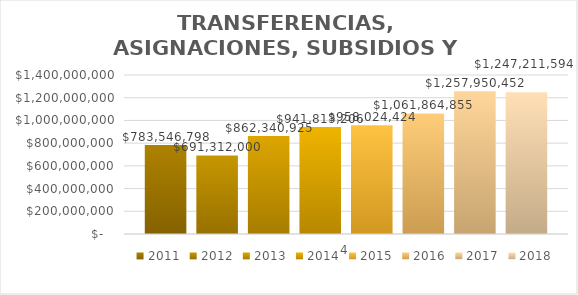
| Category | 2011 | 2012 | 2013 | 2014 | 2015 | 2016 | 2017 | 2018 |
|---|---|---|---|---|---|---|---|---|
| 0 | 783546798 | 691312000 | 862340925 | 941813206.03 | 958024424 | 1061864855.1 | 1257950451.96 | 1247211593.6 |